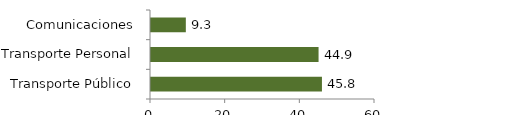
| Category | Transporte y comunicaciones |
|---|---|
| Transporte Público | 45.788 |
| Transporte Personal | 44.883 |
| Comunicaciones | 9.329 |